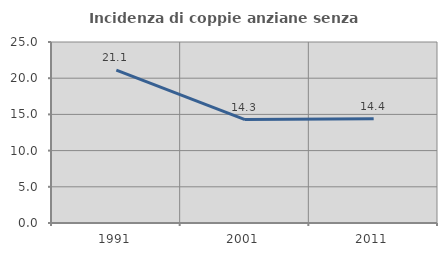
| Category | Incidenza di coppie anziane senza figli  |
|---|---|
| 1991.0 | 21.127 |
| 2001.0 | 14.286 |
| 2011.0 | 14.414 |